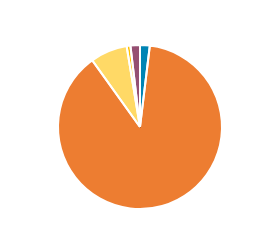
| Category | Series 0 |
|---|---|
|  | 1707 |
|  | 78676 |
|  | 6497 |
|  | 665 |
|  | 1665 |